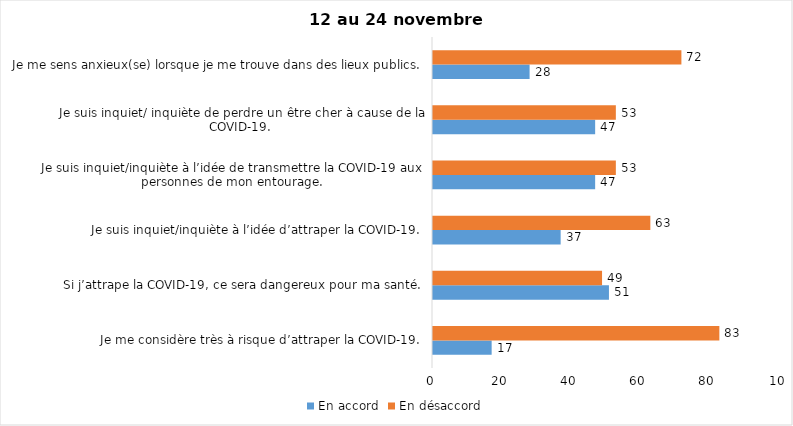
| Category | En accord | En désaccord |
|---|---|---|
| Je me considère très à risque d’attraper la COVID-19. | 17 | 83 |
| Si j’attrape la COVID-19, ce sera dangereux pour ma santé. | 51 | 49 |
| Je suis inquiet/inquiète à l’idée d’attraper la COVID-19. | 37 | 63 |
| Je suis inquiet/inquiète à l’idée de transmettre la COVID-19 aux personnes de mon entourage. | 47 | 53 |
| Je suis inquiet/ inquiète de perdre un être cher à cause de la COVID-19. | 47 | 53 |
| Je me sens anxieux(se) lorsque je me trouve dans des lieux publics. | 28 | 72 |